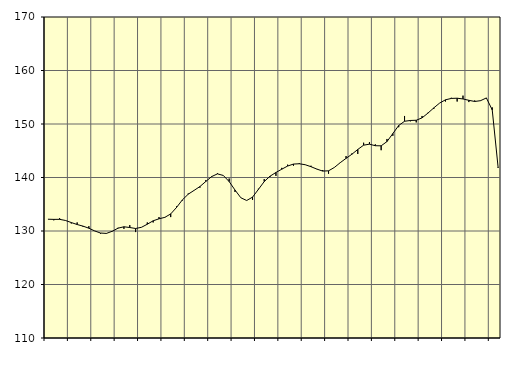
| Category | Piggar | Samtliga sysselsatta (inkl. sysselsatta utomlands) |
|---|---|---|
| nan | 132.2 | 132.2 |
| 1.0 | 132 | 132.17 |
| 1.0 | 132.4 | 132.18 |
| 1.0 | 132 | 131.97 |
| nan | 131.4 | 131.58 |
| 2.0 | 131.6 | 131.21 |
| 2.0 | 130.8 | 130.91 |
| 2.0 | 130.9 | 130.52 |
| nan | 130 | 130.01 |
| 3.0 | 129.5 | 129.62 |
| 3.0 | 129.6 | 129.55 |
| 3.0 | 130 | 129.95 |
| nan | 130.6 | 130.53 |
| 4.0 | 130.4 | 130.79 |
| 4.0 | 131.1 | 130.65 |
| 4.0 | 129.8 | 130.47 |
| nan | 130.7 | 130.69 |
| 5.0 | 131.6 | 131.27 |
| 5.0 | 131.6 | 131.91 |
| 5.0 | 132.6 | 132.28 |
| nan | 132.6 | 132.55 |
| 6.0 | 132.6 | 133.19 |
| 6.0 | 134.6 | 134.4 |
| 6.0 | 135.7 | 135.82 |
| nan | 137 | 136.88 |
| 7.0 | 137.6 | 137.59 |
| 7.0 | 138.1 | 138.31 |
| 7.0 | 139.5 | 139.25 |
| nan | 140.1 | 140.17 |
| 8.0 | 140.8 | 140.68 |
| 8.0 | 140.4 | 140.38 |
| 8.0 | 139.8 | 139.24 |
| nan | 137.3 | 137.66 |
| 9.0 | 136.2 | 136.21 |
| 9.0 | 135.7 | 135.7 |
| 9.0 | 135.8 | 136.33 |
| nan | 137.9 | 137.77 |
| 10.0 | 139.7 | 139.24 |
| 10.0 | 140.1 | 140.25 |
| 10.0 | 140.3 | 140.94 |
| nan | 141.8 | 141.55 |
| 11.0 | 142.4 | 142.14 |
| 11.0 | 142.2 | 142.51 |
| 11.0 | 142.7 | 142.57 |
| nan | 142.4 | 142.39 |
| 12.0 | 142.2 | 142.02 |
| 12.0 | 141.6 | 141.57 |
| 12.0 | 141.4 | 141.2 |
| nan | 140.7 | 141.25 |
| 13.0 | 141.9 | 141.88 |
| 13.0 | 142.8 | 142.77 |
| 13.0 | 144 | 143.58 |
| nan | 144.5 | 144.35 |
| 14.0 | 144.4 | 145.24 |
| 14.0 | 146.5 | 146.04 |
| 14.0 | 146.6 | 146.23 |
| nan | 146.2 | 145.94 |
| 15.0 | 145.1 | 145.92 |
| 15.0 | 147.2 | 146.72 |
| 15.0 | 147.8 | 148.21 |
| nan | 149.4 | 149.72 |
| 16.0 | 151.5 | 150.51 |
| 16.0 | 150.5 | 150.66 |
| 16.0 | 150.3 | 150.7 |
| nan | 151.5 | 151.15 |
| 17.0 | 152.1 | 152.03 |
| 17.0 | 152.8 | 153.01 |
| 17.0 | 153.9 | 153.91 |
| nan | 154.2 | 154.52 |
| 18.0 | 154.9 | 154.78 |
| 18.0 | 154.2 | 154.82 |
| 18.0 | 155.3 | 154.68 |
| nan | 154.1 | 154.43 |
| 19.0 | 154.4 | 154.21 |
| 19.0 | 154.4 | 154.36 |
| 19.0 | 154.8 | 154.87 |
| nan | 153.1 | 152.64 |
| 20.0 | 141.8 | 141.98 |